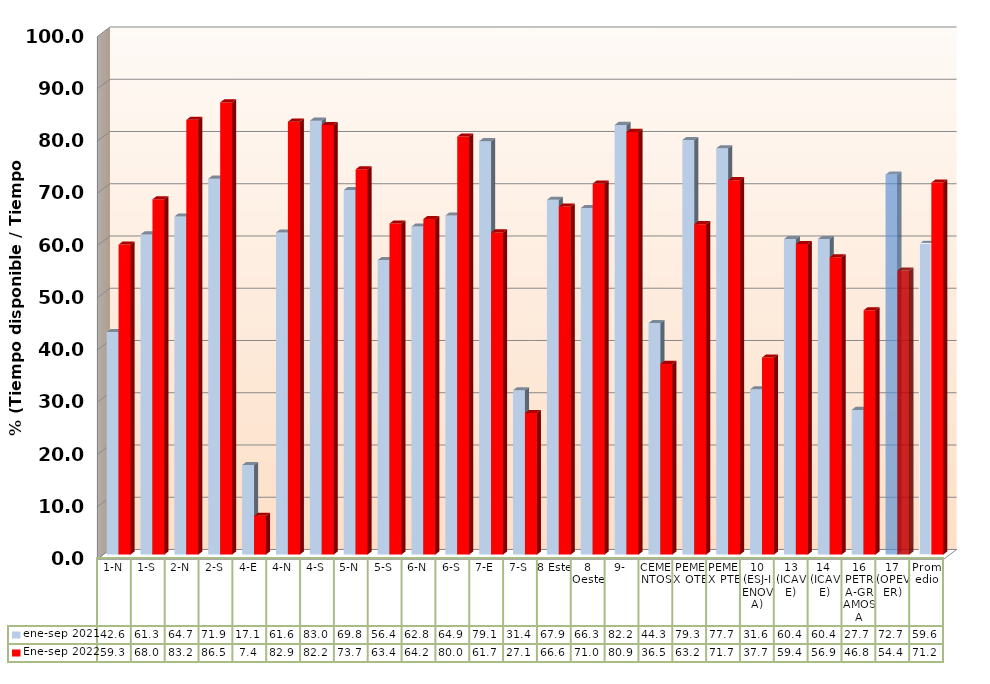
| Category | ene-sep 2021 | Ene-sep 2022 |
|---|---|---|
| 1-N | 42.573 | 59.329 |
| 1-S | 61.269 | 67.994 |
| 2-N | 64.687 | 83.192 |
| 2-S | 71.938 | 86.539 |
| 4-E | 17.124 | 7.418 |
| 4-N | 61.641 | 82.856 |
| 4-S | 83.032 | 82.21 |
| 5-N | 69.759 | 73.729 |
| 5-S | 56.362 | 63.35 |
| 6-N | 62.771 | 64.226 |
| 6-S | 64.879 | 80.004 |
| 7-E | 79.119 | 61.651 |
| 7-S | 31.445 | 27.073 |
| 8 Este | 67.891 | 66.616 |
| 8 Oeste | 66.321 | 71 |
| 9- | 82.221 | 80.894 |
| CEMENTOS | 44.302 | 36.488 |
| PEMEX OTE | 79.346 | 63.23 |
| PEMEX PTE | 77.749 | 71.66 |
| 10 (ESJ-IENOVA) | 31.625 | 37.703 |
| 13 (ICAVE) | 60.369 | 59.42 |
| 14  (ICAVE) | 60.369 | 56.9 |
| 16 PETRA-GRAMOSA | 27.686 | 46.752 |
| 17 (OPEVER) | 72.721 | 54.37 |
| Promedio | 59.558 | 71.188 |